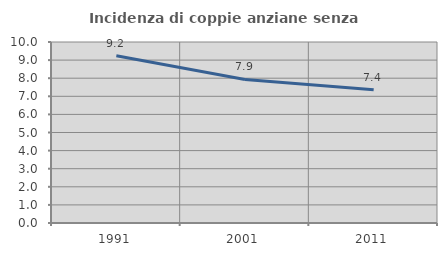
| Category | Incidenza di coppie anziane senza figli  |
|---|---|
| 1991.0 | 9.239 |
| 2001.0 | 7.93 |
| 2011.0 | 7.359 |